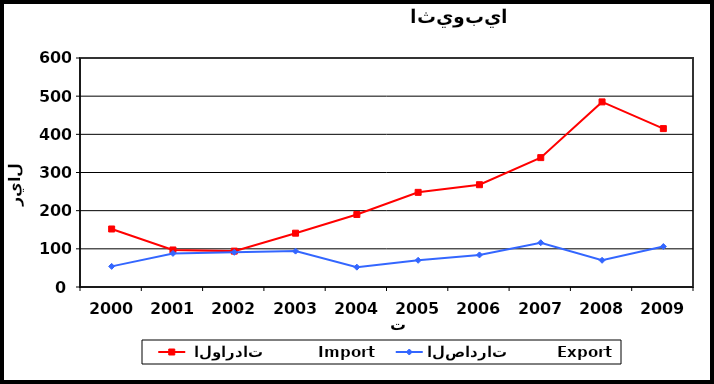
| Category |  الواردات           Import | الصادرات          Export |
|---|---|---|
| 2000.0 | 152 | 54 |
| 2001.0 | 97 | 88 |
| 2002.0 | 94 | 91 |
| 2003.0 | 141 | 94 |
| 2004.0 | 190 | 52 |
| 2005.0 | 248 | 70 |
| 2006.0 | 268 | 84 |
| 2007.0 | 339 | 116 |
| 2008.0 | 485 | 70 |
| 2009.0 | 415 | 106 |